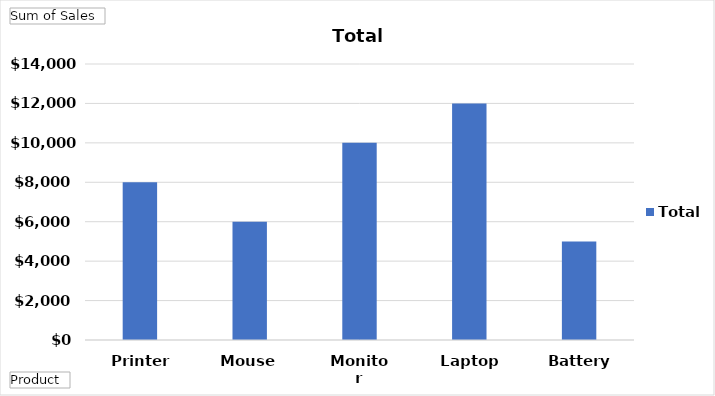
| Category | Total |
|---|---|
| Printer | 8000 |
| Mouse | 6000 |
| Monitor | 10000 |
| Laptop | 12000 |
| Battery | 5000 |